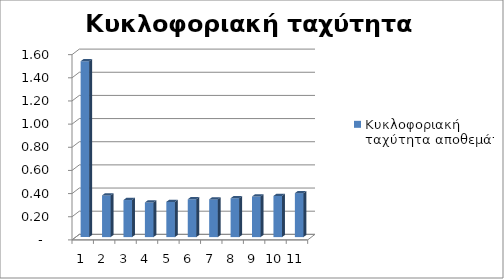
| Category | Κυκλοφοριακή ταχύτητα αποθεμάτων |
|---|---|
| 0 | 1.519 |
| 1 | 0.36 |
| 2 | 0.32 |
| 3 | 0.299 |
| 4 | 0.304 |
| 5 | 0.327 |
| 6 | 0.326 |
| 7 | 0.336 |
| 8 | 0.351 |
| 9 | 0.355 |
| 10 | 0.38 |